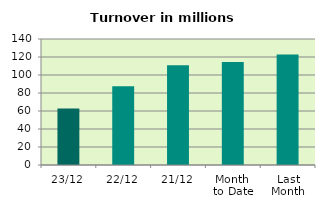
| Category | Series 0 |
|---|---|
| 23/12 | 62.858 |
| 22/12 | 87.496 |
| 21/12 | 110.823 |
| Month 
to Date | 114.454 |
| Last
Month | 122.873 |